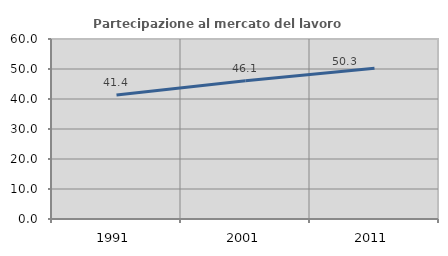
| Category | Partecipazione al mercato del lavoro  femminile |
|---|---|
| 1991.0 | 41.359 |
| 2001.0 | 46.074 |
| 2011.0 | 50.265 |